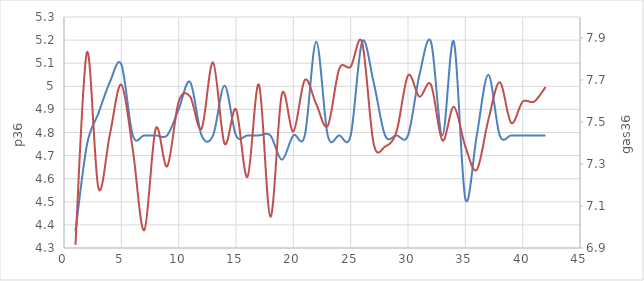
| Category | Series 0 |
|---|---|
| 1.0 | 4.372 |
| 2.0 | 4.747 |
| 3.0 | 4.883 |
| 4.0 | 5.019 |
| 5.0 | 5.095 |
| 6.0 | 4.787 |
| 7.0 | 4.787 |
| 8.0 | 4.787 |
| 9.0 | 4.787 |
| 10.0 | 4.901 |
| 11.0 | 5.019 |
| 12.0 | 4.787 |
| 13.0 | 4.787 |
| 14.0 | 5.003 |
| 15.0 | 4.787 |
| 16.0 | 4.787 |
| 17.0 | 4.787 |
| 18.0 | 4.787 |
| 19.0 | 4.682 |
| 20.0 | 4.787 |
| 21.0 | 4.787 |
| 22.0 | 5.193 |
| 23.0 | 4.787 |
| 24.0 | 4.787 |
| 25.0 | 4.787 |
| 26.0 | 5.193 |
| 27.0 | 5.019 |
| 28.0 | 4.787 |
| 29.0 | 4.787 |
| 30.0 | 4.787 |
| 31.0 | 5.05 |
| 32.0 | 5.193 |
| 33.0 | 4.787 |
| 34.0 | 5.193 |
| 35.0 | 4.513 |
| 36.0 | 4.787 |
| 37.0 | 5.05 |
| 38.0 | 4.787 |
| 39.0 | 4.787 |
| 40.0 | 4.787 |
| 41.0 | 4.787 |
| 42.0 | 4.787 |